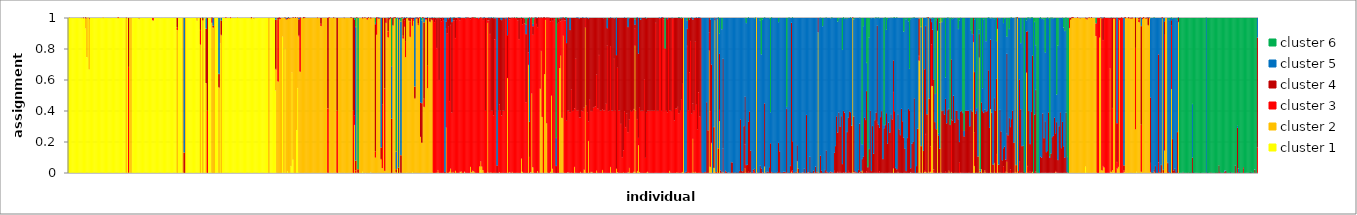
| Category | cluster 1 | cluster 2 | cluster 3 | cluster 4 | cluster 5 | cluster 6 |
|---|---|---|---|---|---|---|
| 0 | 1 | 0 | 0 | 0 | 0 | 0 |
| 1 | 0.999 | 0.001 | 0 | 0 | 0 | 0 |
| 2 | 1 | 0 | 0 | 0 | 0 | 0 |
| 3 | 1 | 0 | 0 | 0 | 0 | 0 |
| 4 | 1 | 0 | 0 | 0 | 0 | 0 |
| 5 | 1 | 0 | 0 | 0 | 0 | 0 |
| 6 | 1 | 0 | 0 | 0 | 0 | 0 |
| 7 | 1 | 0 | 0 | 0 | 0 | 0 |
| 8 | 1 | 0 | 0 | 0 | 0 | 0 |
| 9 | 1 | 0 | 0 | 0 | 0 | 0 |
| 10 | 1 | 0 | 0 | 0 | 0 | 0 |
| 11 | 0.997 | 0.003 | 0 | 0 | 0 | 0 |
| 12 | 1 | 0 | 0 | 0 | 0 | 0 |
| 13 | 0.996 | 0.002 | 0 | 0.002 | 0 | 0 |
| 14 | 1 | 0 | 0 | 0 | 0 | 0 |
| 15 | 0.93 | 0.065 | 0.004 | 0.001 | 0 | 0 |
| 16 | 0.745 | 0.255 | 0 | 0 | 0 | 0 |
| 17 | 0.999 | 0.001 | 0 | 0 | 0 | 0 |
| 18 | 0.666 | 0.326 | 0.004 | 0.004 | 0 | 0 |
| 19 | 1 | 0 | 0 | 0 | 0 | 0 |
| 20 | 1 | 0 | 0 | 0 | 0 | 0 |
| 21 | 1 | 0 | 0 | 0 | 0 | 0 |
| 22 | 1 | 0 | 0 | 0 | 0 | 0 |
| 23 | 1 | 0 | 0 | 0 | 0 | 0 |
| 24 | 1 | 0 | 0 | 0 | 0 | 0 |
| 25 | 1 | 0 | 0 | 0 | 0 | 0 |
| 26 | 1 | 0 | 0 | 0 | 0 | 0 |
| 27 | 1 | 0 | 0 | 0 | 0 | 0 |
| 28 | 1 | 0 | 0 | 0 | 0 | 0 |
| 29 | 1 | 0 | 0 | 0 | 0 | 0 |
| 30 | 0.999 | 0.001 | 0 | 0 | 0 | 0 |
| 31 | 1 | 0 | 0 | 0 | 0 | 0 |
| 32 | 1 | 0 | 0 | 0 | 0 | 0 |
| 33 | 1 | 0 | 0 | 0 | 0 | 0 |
| 34 | 1 | 0 | 0 | 0 | 0 | 0 |
| 35 | 1 | 0 | 0 | 0 | 0 | 0 |
| 36 | 1 | 0 | 0 | 0 | 0 | 0 |
| 37 | 1 | 0 | 0 | 0 | 0 | 0 |
| 38 | 1 | 0 | 0 | 0 | 0 | 0 |
| 39 | 1 | 0 | 0 | 0 | 0 | 0 |
| 40 | 1 | 0 | 0 | 0 | 0 | 0 |
| 41 | 1 | 0 | 0 | 0 | 0 | 0 |
| 42 | 1 | 0 | 0 | 0 | 0 | 0 |
| 43 | 0.998 | 0.001 | 0.001 | 0 | 0 | 0 |
| 44 | 1 | 0 | 0 | 0 | 0 | 0 |
| 45 | 1 | 0 | 0 | 0 | 0 | 0 |
| 46 | 1 | 0 | 0 | 0 | 0 | 0 |
| 47 | 1 | 0 | 0 | 0 | 0 | 0 |
| 48 | 1 | 0 | 0 | 0 | 0 | 0 |
| 49 | 1 | 0 | 0 | 0 | 0 | 0 |
| 50 | 0 | 0.998 | 0 | 0.002 | 0 | 0 |
| 51 | 1 | 0 | 0 | 0 | 0 | 0 |
| 52 | 0 | 0.001 | 0.682 | 0.317 | 0 | 0 |
| 53 | 1 | 0 | 0 | 0 | 0 | 0 |
| 54 | 0 | 1 | 0 | 0 | 0 | 0 |
| 55 | 1 | 0 | 0 | 0 | 0 | 0 |
| 56 | 1 | 0 | 0 | 0 | 0 | 0 |
| 57 | 1 | 0 | 0 | 0 | 0 | 0 |
| 58 | 1 | 0 | 0 | 0 | 0 | 0 |
| 59 | 1 | 0 | 0 | 0 | 0 | 0 |
| 60 | 1 | 0 | 0 | 0 | 0 | 0 |
| 61 | 0.99 | 0.01 | 0 | 0 | 0 | 0 |
| 62 | 1 | 0 | 0 | 0 | 0 | 0 |
| 63 | 1 | 0 | 0 | 0 | 0 | 0 |
| 64 | 1 | 0 | 0 | 0 | 0 | 0 |
| 65 | 1 | 0 | 0 | 0 | 0 | 0 |
| 66 | 1 | 0 | 0 | 0 | 0 | 0 |
| 67 | 1 | 0 | 0 | 0 | 0 | 0 |
| 68 | 1 | 0 | 0 | 0 | 0 | 0 |
| 69 | 1 | 0 | 0 | 0 | 0 | 0 |
| 70 | 1 | 0 | 0 | 0 | 0 | 0 |
| 71 | 1 | 0 | 0 | 0 | 0 | 0 |
| 72 | 1 | 0 | 0 | 0 | 0 | 0 |
| 73 | 0.983 | 0 | 0.017 | 0 | 0 | 0 |
| 74 | 1 | 0 | 0 | 0 | 0 | 0 |
| 75 | 1 | 0 | 0 | 0 | 0 | 0 |
| 76 | 1 | 0 | 0 | 0 | 0 | 0 |
| 77 | 1 | 0 | 0 | 0 | 0 | 0 |
| 78 | 1 | 0 | 0 | 0 | 0 | 0 |
| 79 | 1 | 0 | 0 | 0 | 0 | 0 |
| 80 | 1 | 0 | 0 | 0 | 0 | 0 |
| 81 | 1 | 0 | 0 | 0 | 0 | 0 |
| 82 | 1 | 0 | 0 | 0 | 0 | 0 |
| 83 | 1 | 0 | 0 | 0 | 0 | 0 |
| 84 | 1 | 0 | 0 | 0 | 0 | 0 |
| 85 | 1 | 0 | 0 | 0 | 0 | 0 |
| 86 | 1 | 0 | 0 | 0 | 0 | 0 |
| 87 | 1 | 0 | 0 | 0 | 0 | 0 |
| 88 | 1 | 0 | 0 | 0 | 0 | 0 |
| 89 | 1 | 0 | 0 | 0 | 0 | 0 |
| 90 | 1 | 0 | 0 | 0 | 0 | 0 |
| 91 | 1 | 0 | 0 | 0 | 0 | 0 |
| 92 | 1 | 0 | 0 | 0 | 0 | 0 |
| 93 | 1 | 0 | 0 | 0 | 0 | 0 |
| 94 | 0 | 0.92 | 0.016 | 0.064 | 0 | 0 |
| 95 | 1 | 0 | 0 | 0 | 0 | 0 |
| 96 | 1 | 0 | 0 | 0 | 0 | 0 |
| 97 | 1 | 0 | 0 | 0 | 0 | 0 |
| 98 | 1 | 0 | 0 | 0 | 0 | 0 |
| 99 | 0 | 1 | 0 | 0 | 0 | 0 |
| 100 | 0 | 0 | 0 | 0.13 | 0.87 | 0 |
| 101 | 0 | 1 | 0 | 0 | 0 | 0 |
| 102 | 1 | 0 | 0 | 0 | 0 | 0 |
| 103 | 1 | 0 | 0 | 0 | 0 | 0 |
| 104 | 1 | 0 | 0 | 0 | 0 | 0 |
| 105 | 1 | 0 | 0 | 0 | 0 | 0 |
| 106 | 1 | 0 | 0 | 0 | 0 | 0 |
| 107 | 1 | 0 | 0 | 0 | 0 | 0 |
| 108 | 1 | 0 | 0 | 0 | 0 | 0 |
| 109 | 1 | 0 | 0 | 0 | 0 | 0 |
| 110 | 1 | 0 | 0 | 0 | 0 | 0 |
| 111 | 0.98 | 0.02 | 0 | 0 | 0 | 0 |
| 112 | 1 | 0 | 0 | 0 | 0 | 0 |
| 113 | 1 | 0 | 0 | 0 | 0 | 0 |
| 114 | 0 | 0.827 | 0.094 | 0.079 | 0 | 0 |
| 115 | 1 | 0 | 0 | 0 | 0 | 0 |
| 116 | 0 | 0.985 | 0.001 | 0.013 | 0.002 | 0 |
| 117 | 1 | 0 | 0 | 0 | 0 | 0 |
| 118 | 1 | 0 | 0 | 0 | 0 | 0 |
| 119 | 0 | 0.577 | 0 | 0.352 | 0.068 | 0.003 |
| 120 | 0 | 0 | 0.4 | 0.6 | 0 | 0 |
| 121 | 1 | 0 | 0 | 0 | 0 | 0 |
| 122 | 1 | 0 | 0 | 0 | 0 | 0 |
| 123 | 1 | 0 | 0 | 0 | 0 | 0 |
| 124 | 0 | 0.967 | 0.032 | 0.001 | 0 | 0 |
| 125 | 0 | 0.937 | 0 | 0.011 | 0.052 | 0 |
| 126 | 0 | 1 | 0 | 0 | 0 | 0 |
| 127 | 1 | 0 | 0 | 0 | 0 | 0 |
| 128 | 1 | 0 | 0 | 0 | 0 | 0 |
| 129 | 1 | 0 | 0 | 0 | 0 | 0 |
| 130 | 0 | 0.546 | 0.006 | 0.086 | 0.362 | 0 |
| 131 | 0.836 | 0.164 | 0 | 0 | 0 | 0 |
| 132 | 0 | 0.886 | 0.004 | 0.092 | 0.018 | 0 |
| 133 | 1 | 0 | 0 | 0 | 0 | 0 |
| 134 | 1 | 0 | 0 | 0 | 0 | 0 |
| 135 | 1 | 0 | 0 | 0 | 0 | 0 |
| 136 | 1 | 0 | 0 | 0 | 0 | 0 |
| 137 | 1 | 0 | 0 | 0 | 0 | 0 |
| 138 | 1 | 0 | 0 | 0 | 0 | 0 |
| 139 | 1 | 0 | 0 | 0 | 0 | 0 |
| 140 | 0.999 | 0 | 0.001 | 0 | 0 | 0 |
| 141 | 1 | 0 | 0 | 0 | 0 | 0 |
| 142 | 1 | 0 | 0 | 0 | 0 | 0 |
| 143 | 1 | 0 | 0 | 0 | 0 | 0 |
| 144 | 1 | 0 | 0 | 0 | 0 | 0 |
| 145 | 1 | 0 | 0 | 0 | 0 | 0 |
| 146 | 0.999 | 0.001 | 0 | 0 | 0 | 0 |
| 147 | 1 | 0 | 0 | 0 | 0 | 0 |
| 148 | 1 | 0 | 0 | 0 | 0 | 0 |
| 149 | 1 | 0 | 0 | 0 | 0 | 0 |
| 150 | 1 | 0 | 0 | 0 | 0 | 0 |
| 151 | 1 | 0 | 0 | 0 | 0 | 0 |
| 152 | 1 | 0 | 0 | 0 | 0 | 0 |
| 153 | 1 | 0 | 0 | 0 | 0 | 0 |
| 154 | 1 | 0 | 0 | 0 | 0 | 0 |
| 155 | 1 | 0 | 0 | 0 | 0 | 0 |
| 156 | 1 | 0 | 0 | 0 | 0 | 0 |
| 157 | 1 | 0 | 0 | 0 | 0 | 0 |
| 158 | 0.989 | 0.01 | 0 | 0 | 0 | 0 |
| 159 | 1 | 0 | 0 | 0 | 0 | 0 |
| 160 | 0.991 | 0.009 | 0 | 0 | 0 | 0 |
| 161 | 1 | 0 | 0 | 0 | 0 | 0 |
| 162 | 1 | 0 | 0 | 0 | 0 | 0 |
| 163 | 1 | 0 | 0 | 0 | 0 | 0 |
| 164 | 1 | 0 | 0 | 0 | 0 | 0 |
| 165 | 1 | 0 | 0 | 0 | 0 | 0 |
| 166 | 1 | 0 | 0 | 0 | 0 | 0 |
| 167 | 1 | 0 | 0 | 0 | 0 | 0 |
| 168 | 1 | 0 | 0 | 0 | 0 | 0 |
| 169 | 1 | 0 | 0 | 0 | 0 | 0 |
| 170 | 1 | 0 | 0 | 0 | 0 | 0 |
| 171 | 1 | 0 | 0 | 0 | 0 | 0 |
| 172 | 1 | 0 | 0 | 0 | 0 | 0 |
| 173 | 0 | 1 | 0 | 0 | 0 | 0 |
| 174 | 1 | 0 | 0 | 0 | 0 | 0 |
| 175 | 1 | 0 | 0 | 0 | 0 | 0 |
| 176 | 1 | 0 | 0 | 0 | 0 | 0 |
| 177 | 1 | 0 | 0 | 0 | 0 | 0 |
| 178 | 1 | 0 | 0 | 0 | 0 | 0 |
| 179 | 0.53 | 0.134 | 0.005 | 0.317 | 0.013 | 0 |
| 180 | 0 | 1 | 0 | 0 | 0 | 0 |
| 181 | 0 | 0.589 | 0.398 | 0.014 | 0 | 0 |
| 182 | 0 | 0.991 | 0.008 | 0.001 | 0 | 0 |
| 183 | 0 | 0.993 | 0.007 | 0 | 0 | 0 |
| 184 | 0 | 1 | 0 | 0 | 0 | 0 |
| 185 | 0.878 | 0.122 | 0 | 0 | 0 | 0 |
| 186 | 0.001 | 0.999 | 0 | 0 | 0 | 0 |
| 187 | 0.801 | 0.198 | 0 | 0.001 | 0 | 0 |
| 188 | 0 | 0.99 | 0.002 | 0.002 | 0.006 | 0 |
| 189 | 0.01 | 0.982 | 0.001 | 0.007 | 0 | 0 |
| 190 | 0.001 | 0.998 | 0 | 0.001 | 0.001 | 0 |
| 191 | 0 | 0.995 | 0.005 | 0 | 0 | 0 |
| 192 | 0.043 | 0.957 | 0 | 0 | 0 | 0 |
| 193 | 0.648 | 0.352 | 0 | 0 | 0 | 0 |
| 194 | 0.084 | 0.916 | 0 | 0 | 0 | 0 |
| 195 | 0 | 1 | 0 | 0 | 0 | 0 |
| 196 | 0 | 1 | 0 | 0 | 0 | 0 |
| 197 | 0.275 | 0.725 | 0 | 0 | 0 | 0 |
| 198 | 0.546 | 0.453 | 0.001 | 0 | 0 | 0 |
| 199 | 0.001 | 0.878 | 0.008 | 0.103 | 0.01 | 0 |
| 200 | 0 | 0.652 | 0.348 | 0.001 | 0 | 0 |
| 201 | 0 | 1 | 0 | 0 | 0 | 0 |
| 202 | 0 | 1 | 0 | 0 | 0 | 0 |
| 203 | 0 | 0.997 | 0.003 | 0 | 0 | 0 |
| 204 | 0 | 0.999 | 0 | 0.001 | 0 | 0 |
| 205 | 0 | 1 | 0 | 0 | 0 | 0 |
| 206 | 0 | 1 | 0 | 0 | 0 | 0 |
| 207 | 0 | 1 | 0 | 0 | 0 | 0 |
| 208 | 0 | 1 | 0 | 0 | 0 | 0 |
| 209 | 0 | 1 | 0 | 0 | 0 | 0 |
| 210 | 0 | 1 | 0 | 0 | 0 | 0 |
| 211 | 0 | 1 | 0 | 0 | 0 | 0 |
| 212 | 0 | 1 | 0 | 0 | 0 | 0 |
| 213 | 0 | 1 | 0 | 0 | 0 | 0 |
| 214 | 0 | 1 | 0 | 0 | 0 | 0 |
| 215 | 0 | 0.998 | 0.002 | 0 | 0 | 0 |
| 216 | 0 | 1 | 0 | 0 | 0 | 0 |
| 217 | 0 | 1 | 0 | 0 | 0 | 0 |
| 218 | 0 | 0.946 | 0.014 | 0.04 | 0 | 0 |
| 219 | 0 | 1 | 0 | 0 | 0 | 0 |
| 220 | 0 | 1 | 0 | 0 | 0 | 0 |
| 221 | 0 | 1 | 0 | 0 | 0 | 0 |
| 222 | 0 | 1 | 0 | 0 | 0 | 0 |
| 223 | 0 | 1 | 0 | 0 | 0 | 0 |
| 224 | 0 | 0 | 0.415 | 0.585 | 0 | 0 |
| 225 | 0 | 1 | 0 | 0 | 0 | 0 |
| 226 | 0 | 1 | 0 | 0 | 0 | 0 |
| 227 | 0 | 1 | 0 | 0 | 0 | 0 |
| 228 | 0 | 1 | 0 | 0 | 0 | 0 |
| 229 | 0 | 0.999 | 0 | 0.001 | 0 | 0 |
| 230 | 0 | 1 | 0 | 0 | 0 | 0 |
| 231 | 0 | 1 | 0 | 0 | 0 | 0 |
| 232 | 0 | 0 | 0.4 | 0.6 | 0 | 0 |
| 233 | 0 | 1 | 0 | 0 | 0 | 0 |
| 234 | 0.002 | 0.998 | 0 | 0 | 0 | 0 |
| 235 | 0 | 1 | 0 | 0 | 0 | 0 |
| 236 | 0 | 1 | 0 | 0 | 0 | 0 |
| 237 | 0 | 1 | 0 | 0 | 0 | 0 |
| 238 | 0.002 | 0.996 | 0 | 0.002 | 0 | 0 |
| 239 | 0 | 1 | 0 | 0 | 0 | 0 |
| 240 | 0 | 1 | 0 | 0 | 0 | 0 |
| 241 | 0 | 1 | 0 | 0 | 0 | 0 |
| 242 | 0 | 1 | 0 | 0 | 0 | 0 |
| 243 | 0 | 1 | 0 | 0 | 0 | 0 |
| 244 | 0 | 1 | 0 | 0 | 0 | 0 |
| 245 | 0 | 1 | 0 | 0 | 0 | 0 |
| 246 | 0 | 0 | 0.4 | 0.6 | 0 | 0 |
| 247 | 0 | 0.309 | 0.06 | 0.619 | 0.006 | 0.006 |
| 248 | 0 | 0 | 0.015 | 0.063 | 0.863 | 0.06 |
| 249 | 0 | 1 | 0 | 0 | 0 | 0 |
| 250 | 0 | 0 | 0 | 0.023 | 0 | 0.977 |
| 251 | 0 | 1 | 0 | 0 | 0 | 0 |
| 252 | 0 | 1 | 0 | 0 | 0 | 0 |
| 253 | 0 | 1 | 0 | 0 | 0 | 0 |
| 254 | 0.006 | 0.991 | 0.002 | 0.001 | 0 | 0 |
| 255 | 0 | 1 | 0 | 0 | 0 | 0 |
| 256 | 0 | 0.999 | 0 | 0.001 | 0 | 0 |
| 257 | 0 | 1 | 0 | 0 | 0 | 0 |
| 258 | 0 | 0.988 | 0.012 | 0 | 0 | 0 |
| 259 | 0 | 0.999 | 0 | 0.001 | 0 | 0 |
| 260 | 0 | 1 | 0 | 0 | 0 | 0 |
| 261 | 0.004 | 0.994 | 0.001 | 0.002 | 0 | 0 |
| 262 | 0 | 1 | 0 | 0 | 0 | 0 |
| 263 | 0 | 1 | 0 | 0 | 0 | 0 |
| 264 | 0 | 1 | 0 | 0 | 0 | 0 |
| 265 | 0 | 0.098 | 0.04 | 0.821 | 0.008 | 0.034 |
| 266 | 0 | 0.89 | 0.109 | 0.001 | 0 | 0 |
| 267 | 0 | 0.995 | 0.004 | 0.001 | 0 | 0 |
| 268 | 0 | 0.994 | 0.001 | 0.004 | 0.001 | 0 |
| 269 | 0 | 1 | 0 | 0 | 0 | 0 |
| 270 | 0 | 0.088 | 0 | 0.074 | 0.837 | 0 |
| 271 | 0 | 0.029 | 0.414 | 0.557 | 0 | 0 |
| 272 | 0 | 1 | 0 | 0 | 0 | 0 |
| 273 | 0 | 0.012 | 0.531 | 0.457 | 0 | 0 |
| 274 | 0 | 0.967 | 0.027 | 0.007 | 0 | 0 |
| 275 | 0 | 1 | 0 | 0 | 0 | 0 |
| 276 | 0 | 0.873 | 0.04 | 0.085 | 0.002 | 0 |
| 277 | 0 | 0.986 | 0.005 | 0.009 | 0 | 0 |
| 278 | 0 | 0.997 | 0.001 | 0.001 | 0 | 0 |
| 279 | 0 | 0 | 0 | 0.348 | 0.34 | 0.312 |
| 280 | 0 | 0.951 | 0.002 | 0.048 | 0 | 0 |
| 281 | 0 | 0.999 | 0 | 0.001 | 0 | 0 |
| 282 | 0 | 0.998 | 0.001 | 0 | 0 | 0 |
| 283 | 0 | 0 | 0.004 | 0.019 | 0.113 | 0.864 |
| 284 | 0.022 | 0.972 | 0 | 0.003 | 0.003 | 0 |
| 285 | 0 | 0 | 0 | 0.033 | 0.967 | 0 |
| 286 | 0 | 0.989 | 0 | 0.011 | 0 | 0 |
| 287 | 0 | 0 | 0 | 0.113 | 0.862 | 0.025 |
| 288 | 0 | 1 | 0 | 0 | 0 | 0 |
| 289 | 0 | 0.866 | 0.017 | 0.111 | 0.006 | 0 |
| 290 | 0 | 0.942 | 0.04 | 0.018 | 0 | 0 |
| 291 | 0 | 0.745 | 0.104 | 0.15 | 0 | 0 |
| 292 | 0.001 | 0.996 | 0 | 0.002 | 0.001 | 0 |
| 293 | 0 | 1 | 0 | 0 | 0 | 0 |
| 294 | 0 | 0.978 | 0.006 | 0.016 | 0 | 0 |
| 295 | 0 | 0.876 | 0.099 | 0.023 | 0.001 | 0 |
| 296 | 0 | 0.993 | 0.002 | 0.006 | 0 | 0 |
| 297 | 0.005 | 0.943 | 0.045 | 0.007 | 0 | 0 |
| 298 | 0 | 0.98 | 0.008 | 0.011 | 0 | 0 |
| 299 | 0 | 0.481 | 0.001 | 0.074 | 0.444 | 0 |
| 300 | 0 | 0.993 | 0 | 0.006 | 0.001 | 0 |
| 301 | 0 | 0.996 | 0.003 | 0.001 | 0 | 0 |
| 302 | 0 | 0.954 | 0.008 | 0.038 | 0 | 0 |
| 303 | 0 | 0.999 | 0.001 | 0 | 0 | 0 |
| 304 | 0 | 0.233 | 0 | 0.22 | 0.546 | 0.001 |
| 305 | 0 | 0.195 | 0.001 | 0.254 | 0.534 | 0.016 |
| 306 | 0 | 0.999 | 0 | 0.001 | 0 | 0 |
| 307 | 0 | 0.424 | 0.052 | 0.494 | 0.029 | 0 |
| 308 | 0 | 0.986 | 0.004 | 0.011 | 0 | 0 |
| 309 | 0 | 0.986 | 0.004 | 0.011 | 0 | 0 |
| 310 | 0 | 0.545 | 0.146 | 0.309 | 0 | 0 |
| 311 | 0 | 1 | 0 | 0 | 0 | 0 |
| 312 | 0 | 0.971 | 0.003 | 0.026 | 0 | 0 |
| 313 | 0 | 0.991 | 0.002 | 0.007 | 0 | 0 |
| 314 | 0 | 0.983 | 0.003 | 0.014 | 0.001 | 0 |
| 315 | 0 | 0 | 1 | 0 | 0 | 0 |
| 316 | 0 | 0 | 0.972 | 0.026 | 0 | 0.002 |
| 317 | 0 | 0 | 0.985 | 0.015 | 0 | 0 |
| 318 | 0 | 0.001 | 0.803 | 0.193 | 0 | 0.003 |
| 319 | 0 | 0.017 | 0.983 | 0 | 0 | 0 |
| 320 | 0 | 0 | 0.598 | 0.399 | 0 | 0.002 |
| 321 | 0 | 0 | 0.989 | 0.011 | 0 | 0 |
| 322 | 0 | 0 | 0.977 | 0.023 | 0 | 0 |
| 323 | 0 | 0 | 0.997 | 0.003 | 0 | 0 |
| 324 | 0 | 0 | 0.98 | 0.02 | 0 | 0 |
| 325 | 0 | 0 | 0 | 0.001 | 0.999 | 0 |
| 326 | 0 | 0.292 | 0.636 | 0.047 | 0.025 | 0 |
| 327 | 0 | 0 | 0.898 | 0.102 | 0 | 0 |
| 328 | 0 | 0.001 | 0.941 | 0.049 | 0.008 | 0 |
| 329 | 0 | 0.006 | 0.456 | 0.538 | 0 | 0 |
| 330 | 0 | 0.026 | 0.927 | 0.046 | 0.001 | 0 |
| 331 | 0 | 0.001 | 0.387 | 0.584 | 0.028 | 0 |
| 332 | 0 | 0.005 | 0.978 | 0.016 | 0 | 0.001 |
| 333 | 0 | 0 | 0.983 | 0.016 | 0 | 0 |
| 334 | 0 | 0.012 | 0.856 | 0.131 | 0 | 0 |
| 335 | 0 | 0.001 | 0.984 | 0.016 | 0 | 0 |
| 336 | 0 | 0 | 0.997 | 0.003 | 0 | 0 |
| 337 | 0 | 0 | 1 | 0 | 0 | 0 |
| 338 | 0.005 | 0.001 | 0.978 | 0.015 | 0.001 | 0 |
| 339 | 0 | 0.009 | 0.991 | 0 | 0 | 0 |
| 340 | 0 | 0.001 | 0.999 | 0 | 0 | 0 |
| 341 | 0 | 0 | 0.994 | 0.006 | 0 | 0 |
| 342 | 0.003 | 0.004 | 0.993 | 0 | 0 | 0 |
| 343 | 0 | 0 | 0.995 | 0.005 | 0.001 | 0 |
| 344 | 0 | 0 | 0.999 | 0.001 | 0 | 0 |
| 345 | 0 | 0 | 0.999 | 0.001 | 0 | 0 |
| 346 | 0 | 0 | 1 | 0 | 0 | 0 |
| 347 | 0 | 0.038 | 0.95 | 0.012 | 0 | 0 |
| 348 | 0 | 0.004 | 0.994 | 0.002 | 0 | 0 |
| 349 | 0 | 0.013 | 0.987 | 0.001 | 0 | 0 |
| 350 | 0 | 0.008 | 0.991 | 0.001 | 0 | 0 |
| 351 | 0 | 0.002 | 0.996 | 0.002 | 0 | 0 |
| 352 | 0 | 0 | 1 | 0 | 0 | 0 |
| 353 | 0 | 0 | 1 | 0 | 0 | 0 |
| 354 | 0 | 0 | 0.996 | 0 | 0.004 | 0 |
| 355 | 0 | 0.04 | 0.96 | 0 | 0 | 0 |
| 356 | 0.015 | 0.058 | 0.926 | 0.001 | 0 | 0 |
| 357 | 0 | 0.039 | 0.957 | 0.003 | 0 | 0 |
| 358 | 0 | 0.016 | 0.97 | 0.012 | 0.002 | 0 |
| 359 | 0 | 0 | 0.997 | 0.002 | 0.001 | 0 |
| 360 | 0 | 0 | 0.4 | 0.6 | 0 | 0 |
| 361 | 0 | 0 | 1 | 0 | 0 | 0 |
| 362 | 0.005 | 0.962 | 0.015 | 0.018 | 0 | 0 |
| 363 | 0 | 0 | 0.983 | 0.016 | 0.001 | 0 |
| 364 | 0 | 0.002 | 0.893 | 0.102 | 0.003 | 0 |
| 365 | 0 | 0.002 | 0.399 | 0.599 | 0 | 0 |
| 366 | 0 | 0 | 0.4 | 0.6 | 0 | 0 |
| 367 | 0 | 0.001 | 0.369 | 0.628 | 0.001 | 0.002 |
| 368 | 0 | 0 | 0.86 | 0.137 | 0.003 | 0 |
| 369 | 0 | 0 | 0.997 | 0 | 0.003 | 0 |
| 370 | 0 | 0 | 0 | 0.046 | 0.954 | 0 |
| 371 | 0 | 0 | 0.4 | 0.6 | 0 | 0 |
| 372 | 0 | 0.004 | 0.436 | 0.56 | 0 | 0 |
| 373 | 0 | 0 | 0.401 | 0.59 | 0.01 | 0 |
| 374 | 0 | 0 | 0.369 | 0.616 | 0.015 | 0 |
| 375 | 0 | 0 | 0.4 | 0.6 | 0 | 0 |
| 376 | 0 | 0 | 0.4 | 0.6 | 0 | 0 |
| 377 | 0 | 0 | 0.99 | 0.001 | 0.009 | 0 |
| 378 | 0 | 0 | 0.997 | 0.003 | 0 | 0 |
| 379 | 0 | 0.611 | 0 | 0.277 | 0.112 | 0 |
| 380 | 0 | 0.001 | 0.998 | 0.001 | 0 | 0 |
| 381 | 0 | 0.004 | 0.986 | 0.01 | 0 | 0 |
| 382 | 0 | 0 | 1 | 0 | 0 | 0 |
| 383 | 0 | 0.005 | 0.993 | 0.002 | 0 | 0 |
| 384 | 0 | 0 | 1 | 0 | 0 | 0 |
| 385 | 0 | 0 | 0.999 | 0.001 | 0 | 0 |
| 386 | 0 | 0 | 0.996 | 0.004 | 0 | 0 |
| 387 | 0 | 0 | 1 | 0 | 0 | 0 |
| 388 | 0 | 0 | 0.981 | 0.018 | 0 | 0 |
| 389 | 0 | 0 | 0.862 | 0.138 | 0 | 0 |
| 390 | 0 | 0 | 1 | 0 | 0 | 0 |
| 391 | 0.007 | 0.085 | 0.896 | 0.011 | 0 | 0.001 |
| 392 | 0 | 0.006 | 0.951 | 0.043 | 0 | 0 |
| 393 | 0 | 0 | 1 | 0 | 0 | 0 |
| 394 | 0 | 0 | 0.963 | 0.03 | 0.002 | 0.005 |
| 395 | 0 | 0.001 | 0.454 | 0.44 | 0.062 | 0.043 |
| 396 | 0 | 0 | 0.993 | 0 | 0 | 0.007 |
| 397 | 0 | 0.696 | 0.081 | 0.223 | 0 | 0 |
| 398 | 0 | 0 | 0.102 | 0.228 | 0.669 | 0.001 |
| 399 | 0 | 0.004 | 0.991 | 0.005 | 0 | 0 |
| 400 | 0 | 0.511 | 0.488 | 0.001 | 0 | 0 |
| 401 | 0.035 | 0 | 0.856 | 0.055 | 0.016 | 0.039 |
| 402 | 0 | 0 | 0.988 | 0.008 | 0.002 | 0.002 |
| 403 | 0 | 0 | 0.999 | 0.001 | 0 | 0 |
| 404 | 0 | 0 | 0.96 | 0.039 | 0.001 | 0 |
| 405 | 0 | 0.01 | 0.93 | 0.06 | 0 | 0 |
| 406 | 0 | 0 | 0.999 | 0.001 | 0 | 0 |
| 407 | 0 | 0.541 | 0.459 | 0 | 0 | 0 |
| 408 | 0 | 0.786 | 0.214 | 0.001 | 0 | 0 |
| 409 | 0 | 0.359 | 0.641 | 0 | 0 | 0 |
| 410 | 0 | 0 | 0.999 | 0.001 | 0 | 0 |
| 411 | 0 | 0.636 | 0.364 | 0 | 0 | 0 |
| 412 | 0 | 0.985 | 0.015 | 0 | 0 | 0 |
| 413 | 0 | 0.318 | 0.681 | 0.001 | 0 | 0 |
| 414 | 0 | 0 | 0.998 | 0.002 | 0 | 0 |
| 415 | 0 | 0 | 0.998 | 0.002 | 0 | 0 |
| 416 | 0 | 0.006 | 0.97 | 0.024 | 0 | 0 |
| 417 | 0 | 0.498 | 0.502 | 0 | 0 | 0 |
| 418 | 0 | 0.025 | 0.954 | 0.021 | 0 | 0 |
| 419 | 0 | 0 | 1 | 0 | 0 | 0 |
| 420 | 0 | 0 | 0.991 | 0.009 | 0 | 0 |
| 421 | 0 | 0 | 0 | 0.043 | 0.181 | 0.776 |
| 422 | 0 | 0 | 0.96 | 0.04 | 0 | 0 |
| 423 | 0 | 0 | 0.968 | 0.023 | 0 | 0.008 |
| 424 | 0 | 0.674 | 0.322 | 0.004 | 0 | 0 |
| 425 | 0 | 0.755 | 0.223 | 0.019 | 0.001 | 0.002 |
| 426 | 0 | 0.354 | 0.631 | 0.014 | 0.002 | 0 |
| 427 | 0 | 0.884 | 0.115 | 0.001 | 0 | 0 |
| 428 | 0 | 0 | 0.982 | 0.017 | 0 | 0 |
| 429 | 0 | 0 | 0.984 | 0.015 | 0.001 | 0.001 |
| 430 | 0 | 0 | 0.335 | 0.502 | 0.162 | 0.001 |
| 431 | 0 | 0.003 | 0.397 | 0.601 | 0 | 0 |
| 432 | 0 | 0.002 | 0.4 | 0.598 | 0 | 0 |
| 433 | 0 | 0 | 0.388 | 0.533 | 0.078 | 0 |
| 434 | 0 | 0.002 | 0.535 | 0.463 | 0 | 0 |
| 435 | 0 | 0 | 0.398 | 0.602 | 0 | 0 |
| 436 | 0 | 0 | 0.399 | 0.6 | 0 | 0 |
| 437 | 0 | 0.038 | 0.378 | 0.585 | 0 | 0 |
| 438 | 0 | 0 | 0.735 | 0.265 | 0 | 0 |
| 439 | 0 | 0 | 0.402 | 0.598 | 0 | 0 |
| 440 | 0 | 0 | 0.404 | 0.594 | 0.002 | 0 |
| 441 | 0 | 0 | 0.356 | 0.639 | 0.004 | 0 |
| 442 | 0 | 0.006 | 0.351 | 0.643 | 0 | 0 |
| 443 | 0 | 0 | 0.4 | 0.6 | 0 | 0 |
| 444 | 0 | 0 | 0.398 | 0.602 | 0 | 0 |
| 445 | 0 | 0.019 | 0.4 | 0.581 | 0 | 0 |
| 446 | 0 | 0.937 | 0.056 | 0.007 | 0 | 0 |
| 447 | 0 | 0 | 0.431 | 0.567 | 0.001 | 0 |
| 448 | 0 | 0 | 0.391 | 0.609 | 0 | 0 |
| 449 | 0 | 0.205 | 0.126 | 0.665 | 0.005 | 0 |
| 450 | 0 | 0.001 | 0.469 | 0.53 | 0 | 0 |
| 451 | 0 | 0.005 | 0.393 | 0.602 | 0 | 0 |
| 452 | 0 | 0.005 | 0.393 | 0.602 | 0 | 0 |
| 453 | 0 | 0 | 0.42 | 0.58 | 0 | 0 |
| 454 | 0 | 0 | 0.425 | 0.575 | 0 | 0 |
| 455 | 0 | 0 | 0.429 | 0.571 | 0 | 0 |
| 456 | 0 | 0.013 | 0.619 | 0.368 | 0 | 0 |
| 457 | 0 | 0 | 0.414 | 0.586 | 0 | 0 |
| 458 | 0 | 0 | 0.759 | 0.241 | 0 | 0 |
| 459 | 0 | 0 | 0.401 | 0.599 | 0 | 0 |
| 460 | 0 | 0 | 0.4 | 0.6 | 0 | 0 |
| 461 | 0 | 0.018 | 0.391 | 0.591 | 0 | 0 |
| 462 | 0 | 0 | 0.402 | 0.595 | 0.003 | 0 |
| 463 | 0 | 0 | 0.404 | 0.596 | 0 | 0 |
| 464 | 0 | 0 | 0.445 | 0.555 | 0 | 0 |
| 465 | 0 | 0 | 0.82 | 0.113 | 0.059 | 0.008 |
| 466 | 0 | 0 | 0.398 | 0.602 | 0 | 0 |
| 467 | 0 | 0 | 0.4 | 0.6 | 0 | 0 |
| 468 | 0 | 0.037 | 0.775 | 0.186 | 0.001 | 0 |
| 469 | 0 | 0 | 0.401 | 0.599 | 0 | 0 |
| 470 | 0 | 0 | 0.4 | 0.6 | 0 | 0 |
| 471 | 0 | 0 | 0.734 | 0.261 | 0.005 | 0 |
| 472 | 0 | 0 | 0.401 | 0.599 | 0 | 0 |
| 473 | 0 | 0.026 | 0.001 | 0.731 | 0.239 | 0.002 |
| 474 | 0 | 0.003 | 0.674 | 0.323 | 0 | 0 |
| 475 | 0 | 0 | 0.4 | 0.6 | 0 | 0 |
| 476 | 0 | 0 | 0.4 | 0.6 | 0 | 0 |
| 477 | 0 | 0 | 0.315 | 0.685 | 0 | 0 |
| 478 | 0 | 0 | 0.1 | 0.9 | 0 | 0 |
| 479 | 0 | 0.002 | 0.142 | 0.855 | 0 | 0 |
| 480 | 0 | 0 | 0.396 | 0.602 | 0.001 | 0 |
| 481 | 0 | 0 | 0.294 | 0.706 | 0 | 0 |
| 482 | 0 | 0 | 0.382 | 0.618 | 0 | 0 |
| 483 | 0 | 0.004 | 0.258 | 0.679 | 0.057 | 0.002 |
| 484 | 0 | 0.031 | 0.312 | 0.654 | 0.003 | 0 |
| 485 | 0 | 0 | 0.4 | 0.6 | 0 | 0 |
| 486 | 0 | 0 | 0.393 | 0.607 | 0 | 0 |
| 487 | 0 | 0 | 0.399 | 0.601 | 0 | 0 |
| 488 | 0 | 0.005 | 0.405 | 0.59 | 0 | 0 |
| 489 | 0.82 | 0.001 | 0.108 | 0.027 | 0.033 | 0.012 |
| 490 | 0 | 0 | 0.399 | 0.601 | 0 | 0 |
| 491 | 0 | 0.011 | 0.336 | 0.653 | 0 | 0 |
| 492 | 0 | 0.177 | 0.048 | 0.544 | 0.231 | 0 |
| 493 | 0 | 0.005 | 0.415 | 0.581 | 0 | 0 |
| 494 | 0 | 0 | 0.399 | 0.588 | 0.013 | 0 |
| 495 | 0 | 0 | 0.4 | 0.6 | 0 | 0 |
| 496 | 0 | 0 | 0.4 | 0.6 | 0 | 0 |
| 497 | 0 | 0.001 | 0.602 | 0.397 | 0 | 0 |
| 498 | 0 | 0 | 0.096 | 0.903 | 0.001 | 0 |
| 499 | 0 | 0.002 | 0.385 | 0.609 | 0 | 0.004 |
| 500 | 0 | 0.006 | 0.395 | 0.599 | 0 | 0 |
| 501 | 0 | 0 | 0.4 | 0.6 | 0 | 0 |
| 502 | 0 | 0 | 0.399 | 0.601 | 0 | 0 |
| 503 | 0 | 0 | 0.4 | 0.6 | 0 | 0 |
| 504 | 0 | 0 | 0.4 | 0.6 | 0 | 0 |
| 505 | 0 | 0 | 0.4 | 0.6 | 0 | 0 |
| 506 | 0 | 0 | 0.4 | 0.6 | 0 | 0 |
| 507 | 0 | 0 | 0.967 | 0.033 | 0 | 0 |
| 508 | 0 | 0 | 0.399 | 0.601 | 0 | 0 |
| 509 | 0 | 0 | 0.4 | 0.6 | 0 | 0 |
| 510 | 0 | 0 | 0.994 | 0.005 | 0.001 | 0 |
| 511 | 0 | 0 | 0.994 | 0.006 | 0 | 0 |
| 512 | 0 | 0 | 0.399 | 0.6 | 0 | 0 |
| 513 | 0 | 0 | 1 | 0 | 0 | 0 |
| 514 | 0 | 0 | 0.988 | 0.012 | 0 | 0 |
| 515 | 0 | 0 | 0.799 | 0.002 | 0 | 0.199 |
| 516 | 0 | 0 | 0.4 | 0.6 | 0 | 0 |
| 517 | 0 | 0 | 0.39 | 0.601 | 0.009 | 0 |
| 518 | 0 | 0 | 0.997 | 0.003 | 0 | 0 |
| 519 | 0 | 0.011 | 0.389 | 0.599 | 0 | 0 |
| 520 | 0 | 0 | 0.399 | 0.601 | 0 | 0 |
| 521 | 0 | 0 | 0.996 | 0.002 | 0.002 | 0 |
| 522 | 0 | 0 | 0.994 | 0.006 | 0 | 0 |
| 523 | 0 | 0 | 0.338 | 0.662 | 0 | 0 |
| 524 | 0 | 0 | 0.413 | 0.587 | 0 | 0 |
| 525 | 0 | 0.002 | 0.412 | 0.586 | 0 | 0 |
| 526 | 0 | 0.001 | 0.423 | 0.576 | 0 | 0 |
| 527 | 0 | 0 | 0.382 | 0.618 | 0 | 0 |
| 528 | 0 | 0 | 0.401 | 0.599 | 0 | 0 |
| 529 | 0 | 0.001 | 0.47 | 0.525 | 0.003 | 0.001 |
| 530 | 0 | 0.005 | 0.569 | 0.426 | 0 | 0 |
| 531 | 0 | 1 | 0 | 0 | 0 | 0 |
| 532 | 0 | 0 | 0 | 0 | 1 | 0 |
| 533 | 0 | 0 | 0 | 0.006 | 0.994 | 0 |
| 534 | 0 | 0 | 0.818 | 0.11 | 0.052 | 0.019 |
| 535 | 0 | 0.002 | 0.4 | 0.599 | 0 | 0 |
| 536 | 0 | 0 | 0.648 | 0.341 | 0.002 | 0.009 |
| 537 | 0 | 0 | 0.85 | 0.15 | 0 | 0 |
| 538 | 0 | 0 | 0.38 | 0.618 | 0.001 | 0 |
| 539 | 0 | 0.218 | 0.229 | 0.541 | 0.012 | 0 |
| 540 | 0 | 0.001 | 0.4 | 0.599 | 0 | 0 |
| 541 | 0 | 0.006 | 0.84 | 0.155 | 0 | 0 |
| 542 | 0 | 0 | 0.438 | 0.561 | 0.001 | 0 |
| 543 | 0 | 0 | 0.278 | 0.722 | 0 | 0 |
| 544 | 0 | 0 | 0.519 | 0.48 | 0 | 0 |
| 545 | 0 | 0 | 0.361 | 0.637 | 0.001 | 0 |
| 546 | 0 | 0 | 1 | 0 | 0 | 0 |
| 547 | 0 | 0 | 0 | 0.002 | 0.998 | 0 |
| 548 | 0 | 0 | 0 | 0 | 1 | 0 |
| 549 | 0 | 0 | 0.001 | 0.003 | 0.996 | 0 |
| 550 | 0 | 0 | 0 | 0.005 | 0.995 | 0 |
| 551 | 0 | 0 | 0.001 | 0.454 | 0.544 | 0 |
| 552 | 0 | 0 | 0 | 0.274 | 0.726 | 0 |
| 553 | 0 | 0.789 | 0.116 | 0.095 | 0 | 0 |
| 554 | 0 | 0.038 | 0.36 | 0.59 | 0.008 | 0.004 |
| 555 | 0 | 0.19 | 0.004 | 0.504 | 0.301 | 0 |
| 556 | 0 | 0 | 0 | 0 | 1 | 0 |
| 557 | 0 | 0.032 | 0 | 0.262 | 0.705 | 0 |
| 558 | 0 | 0.982 | 0.015 | 0.003 | 0 | 0 |
| 559 | 0 | 0 | 0 | 0.004 | 0.996 | 0 |
| 560 | 0 | 0.99 | 0 | 0.006 | 0.004 | 0 |
| 561 | 0 | 0 | 0 | 0.158 | 0.842 | 0.001 |
| 562 | 0 | 0.332 | 0.073 | 0.362 | 0.13 | 0.102 |
| 563 | 0 | 0 | 0 | 0.016 | 0.984 | 0 |
| 564 | 0 | 0 | 0 | 0.005 | 0.922 | 0.074 |
| 565 | 0 | 0.005 | 0.152 | 0.579 | 0.264 | 0 |
| 566 | 0 | 0 | 0 | 0 | 1 | 0 |
| 567 | 0 | 0 | 0.01 | 0.003 | 0.987 | 0 |
| 568 | 0 | 0 | 0 | 0.006 | 0.994 | 0 |
| 569 | 0 | 0 | 0 | 0 | 1 | 0 |
| 570 | 0 | 0 | 0 | 0.003 | 0.997 | 0 |
| 571 | 0 | 0 | 0 | 0 | 1 | 0 |
| 572 | 0 | 0 | 0 | 0.068 | 0.932 | 0 |
| 573 | 0 | 0.001 | 0 | 0.066 | 0.933 | 0 |
| 574 | 0 | 0 | 0 | 0.001 | 0.999 | 0 |
| 575 | 0 | 0 | 0 | 0.002 | 0.998 | 0 |
| 576 | 0 | 0 | 0 | 0.002 | 0.998 | 0 |
| 577 | 0 | 0 | 0 | 0 | 1 | 0 |
| 578 | 0 | 0 | 0 | 0.001 | 0.999 | 0 |
| 579 | 0 | 0 | 0 | 0.011 | 0.989 | 0 |
| 580 | 0 | 0 | 0 | 0.345 | 0.655 | 0 |
| 581 | 0 | 0 | 0 | 0.011 | 0.989 | 0 |
| 582 | 0 | 0 | 0 | 0.009 | 0.991 | 0 |
| 583 | 0 | 0 | 0 | 0.301 | 0.699 | 0 |
| 584 | 0 | 0.029 | 0.156 | 0.308 | 0.505 | 0.003 |
| 585 | 0 | 0 | 0 | 0.05 | 0.916 | 0.034 |
| 586 | 0 | 0 | 0 | 0.051 | 0.949 | 0 |
| 587 | 0 | 0 | 0.006 | 0.322 | 0.67 | 0.001 |
| 588 | 0 | 0 | 0 | 0.396 | 0.604 | 0 |
| 589 | 0 | 0.001 | 0.002 | 0.139 | 0.858 | 0 |
| 590 | 0 | 0 | 0 | 0 | 1 | 0 |
| 591 | 0 | 0 | 0.007 | 0.012 | 0.981 | 0 |
| 592 | 0 | 0 | 0.018 | 0.008 | 0.971 | 0.004 |
| 593 | 0 | 0 | 0 | 0.001 | 0.997 | 0.002 |
| 594 | 0 | 1 | 0 | 0 | 0 | 0 |
| 595 | 0 | 0 | 0 | 0 | 1 | 0 |
| 596 | 0 | 0 | 0 | 0.001 | 0.999 | 0 |
| 597 | 0 | 0 | 0 | 0.045 | 0.937 | 0.018 |
| 598 | 0 | 0 | 0 | 0.028 | 0.736 | 0.237 |
| 599 | 0 | 0 | 0 | 0.004 | 0.984 | 0.013 |
| 600 | 0 | 0 | 0 | 0.001 | 0.999 | 0 |
| 601 | 0 | 0.04 | 0 | 0.408 | 0.552 | 0.001 |
| 602 | 0 | 0 | 0 | 0 | 1 | 0 |
| 603 | 0 | 0 | 0 | 0.008 | 0.992 | 0 |
| 604 | 0 | 0 | 0 | 0.005 | 0.995 | 0 |
| 605 | 0 | 0 | 0 | 0.036 | 0.96 | 0.004 |
| 606 | 0 | 0.001 | 0 | 0.189 | 0.2 | 0.61 |
| 607 | 0 | 0 | 0 | 0.005 | 0.995 | 0.001 |
| 608 | 0 | 0 | 0 | 0.001 | 0.999 | 0 |
| 609 | 0 | 0 | 0 | 0.001 | 0.999 | 0 |
| 610 | 0 | 0 | 0 | 0 | 1 | 0 |
| 611 | 0 | 0 | 0 | 0 | 1 | 0 |
| 612 | 0 | 0 | 0 | 0.005 | 0.995 | 0 |
| 613 | 0 | 0 | 0 | 0.193 | 0.779 | 0.028 |
| 614 | 0 | 0 | 0 | 0.139 | 0.861 | 0 |
| 615 | 0 | 0 | 0 | 0.002 | 0.998 | 0 |
| 616 | 0 | 0 | 0 | 0 | 1 | 0 |
| 617 | 0 | 0 | 0 | 0.007 | 0.993 | 0 |
| 618 | 0 | 0 | 0 | 0.006 | 0.994 | 0 |
| 619 | 0 | 0 | 0 | 0.005 | 0.995 | 0 |
| 620 | 0 | 0 | 0 | 0.412 | 0.012 | 0.576 |
| 621 | 0 | 0 | 0 | 0 | 1 | 0 |
| 622 | 0 | 0 | 0 | 0 | 0.999 | 0.001 |
| 623 | 0 | 0 | 0 | 0.044 | 0.956 | 0 |
| 624 | 0 | 0.005 | 0.006 | 0.957 | 0.032 | 0 |
| 625 | 0 | 0 | 0.014 | 0.188 | 0.796 | 0.001 |
| 626 | 0 | 0 | 0 | 0 | 1 | 0 |
| 627 | 0 | 0 | 0 | 0.002 | 0.998 | 0 |
| 628 | 0 | 0 | 0 | 0.006 | 0.994 | 0 |
| 629 | 0 | 0.071 | 0.004 | 0.103 | 0.822 | 0 |
| 630 | 0 | 0 | 0 | 0.027 | 0.973 | 0 |
| 631 | 0 | 0 | 0 | 0 | 1 | 0 |
| 632 | 0 | 0 | 0 | 0.001 | 0.999 | 0 |
| 633 | 0 | 0 | 0 | 0 | 1 | 0 |
| 634 | 0 | 0 | 0 | 0.003 | 0.997 | 0 |
| 635 | 0 | 0 | 0 | 0.026 | 0.974 | 0 |
| 636 | 0 | 0 | 0 | 0 | 1 | 0 |
| 637 | 0 | 0 | 0.001 | 0.373 | 0.627 | 0 |
| 638 | 0 | 0 | 0 | 0.002 | 0.998 | 0 |
| 639 | 0 | 0 | 0 | 0.004 | 0.996 | 0 |
| 640 | 0 | 0 | 0 | 0.103 | 0.897 | 0 |
| 641 | 0 | 0 | 0 | 0 | 1 | 0 |
| 642 | 0 | 0 | 0 | 0 | 1 | 0 |
| 643 | 0 | 0 | 0 | 0.015 | 0.985 | 0 |
| 644 | 0 | 0 | 0 | 0.003 | 0.997 | 0 |
| 645 | 0 | 0 | 0 | 0.04 | 0.96 | 0 |
| 646 | 0 | 0 | 0 | 0.005 | 0.995 | 0 |
| 647 | 0 | 0.906 | 0.094 | 0 | 0 | 0 |
| 648 | 0 | 0 | 0 | 0 | 1 | 0 |
| 649 | 0 | 0 | 0.001 | 0.11 | 0.887 | 0.002 |
| 650 | 0 | 0 | 0 | 0.014 | 0.986 | 0 |
| 651 | 0 | 0 | 0 | 0 | 0.945 | 0.054 |
| 652 | 0 | 0 | 0 | 0 | 1 | 0 |
| 653 | 0 | 0 | 0 | 0.017 | 0.983 | 0 |
| 654 | 0 | 0 | 0.01 | 0.134 | 0.854 | 0.001 |
| 655 | 0 | 0 | 0 | 0.005 | 0.995 | 0 |
| 656 | 0 | 0 | 0 | 0.001 | 0.999 | 0 |
| 657 | 0 | 0 | 0 | 0.002 | 0.998 | 0 |
| 658 | 0 | 0 | 0 | 0.008 | 0.988 | 0.004 |
| 659 | 0 | 0 | 0 | 0.003 | 0.996 | 0.001 |
| 660 | 0 | 0 | 0 | 0.002 | 0.998 | 0 |
| 661 | 0 | 0 | 0.012 | 0.117 | 0.871 | 0 |
| 662 | 0 | 0 | 0 | 0.172 | 0.828 | 0 |
| 663 | 0 | 0 | 0 | 0.364 | 0.636 | 0 |
| 664 | 0 | 0 | 0.005 | 0.255 | 0.716 | 0.025 |
| 665 | 0 | 0 | 0 | 0.388 | 0.606 | 0.006 |
| 666 | 0 | 0 | 0.005 | 0.293 | 0.702 | 0 |
| 667 | 0 | 0 | 0 | 0.366 | 0.634 | 0 |
| 668 | 0 | 0 | 0 | 0.056 | 0.737 | 0.207 |
| 669 | 0 | 0 | 0.002 | 0.396 | 0.6 | 0.001 |
| 670 | 0 | 0 | 0 | 0.388 | 0.606 | 0.006 |
| 671 | 0 | 0 | 0 | 0.003 | 0.997 | 0 |
| 672 | 0 | 0 | 0 | 0.263 | 0.73 | 0.007 |
| 673 | 0 | 0 | 0.012 | 0.344 | 0.644 | 0 |
| 674 | 0 | 0 | 0.002 | 0.393 | 0.604 | 0 |
| 675 | 0 | 0 | 0 | 0.39 | 0.609 | 0.001 |
| 676 | 0 | 0 | 0 | 0.303 | 0.697 | 0 |
| 677 | 0 | 0.999 | 0 | 0.001 | 0 | 0 |
| 678 | 0 | 0 | 0.003 | 0.361 | 0.627 | 0.009 |
| 679 | 0 | 0 | 0.003 | 0.006 | 0.99 | 0 |
| 680 | 0 | 0 | 0.001 | 0.003 | 0.996 | 0 |
| 681 | 0 | 0 | 0 | 0.002 | 0.998 | 0 |
| 682 | 0 | 0 | 0 | 0.018 | 0.982 | 0 |
| 683 | 0 | 0 | 0.003 | 0.314 | 0.68 | 0.002 |
| 684 | 0 | 0 | 0 | 0.009 | 0.991 | 0 |
| 685 | 0.016 | 0 | 0 | 0.072 | 0.094 | 0.818 |
| 686 | 0 | 0 | 0.001 | 0.104 | 0.842 | 0.054 |
| 687 | 0 | 0 | 0 | 0.354 | 0.646 | 0 |
| 688 | 0 | 0 | 0 | 0.341 | 0.659 | 0 |
| 689 | 0 | 0 | 0.01 | 0.518 | 0.181 | 0.291 |
| 690 | 0 | 0 | 0 | 0.036 | 0.002 | 0.962 |
| 691 | 0 | 0 | 0 | 0.153 | 0.721 | 0.126 |
| 692 | 0 | 0 | 0 | 0.4 | 0.6 | 0 |
| 693 | 0 | 0 | 0 | 0.011 | 0.985 | 0.004 |
| 694 | 0 | 0 | 0.001 | 0.301 | 0.698 | 0 |
| 695 | 0 | 0 | 0 | 0.122 | 0.878 | 0 |
| 696 | 0 | 0 | 0 | 0.339 | 0.657 | 0.004 |
| 697 | 0 | 0 | 0 | 0.387 | 0.613 | 0.001 |
| 698 | 0 | 0 | 0.328 | 0.623 | 0.05 | 0 |
| 699 | 0 | 0 | 0 | 0.31 | 0.688 | 0.001 |
| 700 | 0 | 0 | 0.01 | 0.282 | 0.705 | 0.003 |
| 701 | 0 | 0 | 0 | 0.359 | 0.641 | 0 |
| 702 | 0 | 0 | 0 | 0.398 | 0.602 | 0 |
| 703 | 0 | 0 | 0 | 0.089 | 0.911 | 0 |
| 704 | 0 | 0 | 0.001 | 0.287 | 0.02 | 0.692 |
| 705 | 0 | 0 | 0 | 0.308 | 0.691 | 0.001 |
| 706 | 0 | 0 | 0 | 0.385 | 0.538 | 0.078 |
| 707 | 0 | 0 | 0 | 0.188 | 0.803 | 0.008 |
| 708 | 0 | 0 | 0 | 0.323 | 0.677 | 0 |
| 709 | 0 | 0 | 0 | 0.259 | 0.741 | 0 |
| 710 | 0 | 0 | 0 | 0.378 | 0.62 | 0.002 |
| 711 | 0 | 0 | 0 | 0.344 | 0.656 | 0 |
| 712 | 0 | 0.028 | 0.493 | 0.205 | 0.273 | 0.002 |
| 713 | 0 | 0 | 0 | 0.397 | 0.603 | 0.001 |
| 714 | 0 | 0 | 0 | 0.031 | 0.969 | 0 |
| 715 | 0 | 0 | 0 | 0.022 | 0.977 | 0.001 |
| 716 | 0 | 0.002 | 0.004 | 0.372 | 0.622 | 0 |
| 717 | 0 | 0 | 0 | 0.279 | 0.721 | 0 |
| 718 | 0 | 0 | 0 | 0.243 | 0.757 | 0 |
| 719 | 0 | 0 | 0 | 0.413 | 0.587 | 0 |
| 720 | 0 | 0 | 0 | 0.332 | 0.668 | 0 |
| 721 | 0 | 0 | 0 | 0.225 | 0.685 | 0.09 |
| 722 | 0 | 0 | 0 | 0.156 | 0.844 | 0 |
| 723 | 0 | 0 | 0 | 0.011 | 0.978 | 0.011 |
| 724 | 0 | 0 | 0 | 0.224 | 0.776 | 0 |
| 725 | 0 | 0 | 0 | 0.412 | 0.566 | 0.022 |
| 726 | 0 | 0 | 0 | 0.402 | 0.268 | 0.329 |
| 727 | 0 | 0 | 0.004 | 0.025 | 0.963 | 0.008 |
| 728 | 0 | 0 | 0 | 0.187 | 0.813 | 0 |
| 729 | 0 | 0 | 0.001 | 0.199 | 0.798 | 0.002 |
| 730 | 0 | 0 | 0 | 0.481 | 0.519 | 0.001 |
| 731 | 0 | 0 | 0 | 0 | 1 | 0 |
| 732 | 0 | 0 | 0 | 0.043 | 0.957 | 0 |
| 733 | 0 | 0 | 0 | 0.283 | 0.717 | 0 |
| 734 | 0 | 0.723 | 0.03 | 0.241 | 0.005 | 0 |
| 735 | 0 | 1 | 0 | 0 | 0 | 0 |
| 736 | 0 | 0 | 0 | 0.172 | 0.769 | 0.059 |
| 737 | 0 | 1 | 0 | 0 | 0 | 0 |
| 738 | 0 | 0 | 0 | 0.141 | 0.859 | 0 |
| 739 | 0 | 0.005 | 0.007 | 0.656 | 0.332 | 0 |
| 740 | 0 | 0.006 | 0.244 | 0.697 | 0.053 | 0 |
| 741 | 0 | 0 | 0 | 0.377 | 0.622 | 0.001 |
| 742 | 0 | 0.999 | 0 | 0.001 | 0 | 0 |
| 743 | 0 | 0.003 | 0.002 | 0.472 | 0.523 | 0 |
| 744 | 0 | 0.006 | 0.165 | 0.824 | 0.005 | 0 |
| 745 | 0 | 0.56 | 0.268 | 0.145 | 0.023 | 0.004 |
| 746 | 0 | 0.555 | 0.004 | 0.364 | 0.075 | 0.002 |
| 747 | 0 | 0 | 0.02 | 0.58 | 0.4 | 0 |
| 748 | 0 | 0 | 0 | 0.327 | 0.182 | 0.491 |
| 749 | 0 | 0 | 0 | 0.281 | 0.704 | 0.015 |
| 750 | 0 | 0.917 | 0.001 | 0.079 | 0.003 | 0 |
| 751 | 0 | 0 | 0 | 0.241 | 0.012 | 0.746 |
| 752 | 0 | 0 | 0 | 0.156 | 0.814 | 0.03 |
| 753 | 0 | 1 | 0 | 0 | 0 | 0 |
| 754 | 0 | 0 | 0 | 0.398 | 0.574 | 0.027 |
| 755 | 0 | 0 | 0 | 0.403 | 0.59 | 0.007 |
| 756 | 0 | 0 | 0 | 0.376 | 0.624 | 0 |
| 757 | 0 | 0 | 0.007 | 0.47 | 0.138 | 0.386 |
| 758 | 0 | 0 | 0 | 0.319 | 0.681 | 0 |
| 759 | 0 | 0 | 0 | 0.404 | 0.595 | 0.001 |
| 760 | 0 | 0.013 | 0 | 0.399 | 0.585 | 0.002 |
| 761 | 0 | 0 | 0 | 0.309 | 0.001 | 0.69 |
| 762 | 0 | 0.005 | 0.339 | 0.388 | 0.266 | 0.002 |
| 763 | 0 | 0 | 0 | 0.338 | 0.654 | 0.008 |
| 764 | 0 | 0 | 0 | 0.497 | 0.5 | 0.003 |
| 765 | 0 | 0 | 0 | 0.322 | 0.678 | 0 |
| 766 | 0 | 0.001 | 0 | 0.4 | 0.599 | 0 |
| 767 | 0 | 0 | 0 | 0.401 | 0.596 | 0.003 |
| 768 | 0 | 0 | 0 | 0.345 | 0.583 | 0.072 |
| 769 | 0 | 0 | 0.065 | 0.134 | 0.785 | 0.016 |
| 770 | 0 | 0.002 | 0.001 | 0.391 | 0.603 | 0.002 |
| 771 | 0 | 0 | 0 | 0.398 | 0.602 | 0 |
| 772 | 0 | 0 | 0 | 0.386 | 0.008 | 0.606 |
| 773 | 0 | 0 | 0.001 | 0.233 | 0.037 | 0.729 |
| 774 | 0 | 0 | 0 | 0.4 | 0.6 | 0 |
| 775 | 0 | 0 | 0 | 0.4 | 0.6 | 0 |
| 776 | 0 | 0 | 0 | 0.4 | 0.6 | 0 |
| 777 | 0 | 0.001 | 0 | 0.4 | 0.6 | 0 |
| 778 | 0 | 0 | 0 | 0.3 | 0.7 | 0 |
| 779 | 0 | 0 | 0.001 | 0.404 | 0.515 | 0.08 |
| 780 | 0 | 0 | 0 | 0.394 | 0.501 | 0.104 |
| 781 | 0 | 0.843 | 0.048 | 0.11 | 0 | 0 |
| 782 | 0 | 0.044 | 0.215 | 0.391 | 0.338 | 0.012 |
| 783 | 0 | 0 | 0 | 0.38 | 0.62 | 0 |
| 784 | 0 | 0 | 0 | 0.398 | 0.019 | 0.583 |
| 785 | 0 | 0.001 | 0.001 | 0.103 | 0.896 | 0 |
| 786 | 0 | 0.745 | 0.001 | 0.15 | 0.027 | 0.078 |
| 787 | 0 | 0 | 0 | 0.008 | 0.012 | 0.98 |
| 788 | 0 | 0.022 | 0 | 0.432 | 0.546 | 0 |
| 789 | 0 | 0 | 0 | 0.397 | 0.148 | 0.455 |
| 790 | 0 | 0 | 0 | 0.386 | 0.605 | 0.009 |
| 791 | 0 | 0.015 | 0 | 0.394 | 0.591 | 0 |
| 792 | 0 | 0 | 0 | 0.394 | 0.455 | 0.151 |
| 793 | 0 | 0 | 0 | 0.398 | 0.602 | 0 |
| 794 | 0 | 0 | 0 | 0.661 | 0.338 | 0.001 |
| 795 | 0 | 0 | 0 | 0.29 | 0.708 | 0.002 |
| 796 | 0 | 0.41 | 0 | 0.449 | 0.138 | 0.004 |
| 797 | 0 | 0 | 0 | 0.386 | 0.611 | 0.002 |
| 798 | 0 | 0 | 0 | 0.052 | 0.948 | 0 |
| 799 | 0 | 0.064 | 0.001 | 0.417 | 0.51 | 0.008 |
| 800 | 0 | 0 | 0 | 0.4 | 0.6 | 0 |
| 801 | 0 | 0 | 0.121 | 0.485 | 0.244 | 0.15 |
| 802 | 0 | 0.928 | 0.069 | 0.003 | 0 | 0 |
| 803 | 0 | 0 | 0 | 0.052 | 0.948 | 0 |
| 804 | 0 | 0.001 | 0 | 0.405 | 0.59 | 0.005 |
| 805 | 0 | 0 | 0 | 0.265 | 0.735 | 0 |
| 806 | 0 | 0 | 0 | 0.08 | 0.92 | 0 |
| 807 | 0 | 0 | 0.042 | 0.117 | 0.808 | 0.034 |
| 808 | 0 | 0 | 0 | 0.17 | 0.824 | 0.006 |
| 809 | 0 | 0.001 | 0.005 | 0.079 | 0.916 | 0 |
| 810 | 0 | 0.071 | 0.18 | 0.517 | 0.11 | 0.122 |
| 811 | 0 | 0 | 0 | 0.241 | 0.759 | 0 |
| 812 | 0 | 0 | 0 | 0.353 | 0.575 | 0.072 |
| 813 | 0 | 0 | 0.022 | 0.273 | 0.702 | 0.002 |
| 814 | 0 | 0 | 0.001 | 0.345 | 0.653 | 0.001 |
| 815 | 0 | 0 | 0 | 0.401 | 0.599 | 0 |
| 816 | 0 | 0 | 0 | 0.194 | 0.806 | 0 |
| 817 | 0 | 1 | 0 | 0 | 0 | 0 |
| 818 | 0 | 0.004 | 0 | 0.046 | 0.949 | 0.001 |
| 819 | 0 | 0.999 | 0 | 0.001 | 0 | 0 |
| 820 | 0 | 0 | 0 | 0.011 | 0.989 | 0 |
| 821 | 0 | 0 | 0.07 | 0.532 | 0.398 | 0 |
| 822 | 0 | 0 | 0 | 0.41 | 0.427 | 0.164 |
| 823 | 0 | 0.001 | 0 | 0.17 | 0.828 | 0 |
| 824 | 0 | 0 | 0.001 | 0.174 | 0.825 | 0 |
| 825 | 0 | 0 | 0 | 0 | 0 | 1 |
| 826 | 0 | 0 | 0 | 0.002 | 0.998 | 0 |
| 827 | 0 | 0.646 | 0.001 | 0.263 | 0.073 | 0.017 |
| 828 | 0 | 0 | 0.043 | 0.871 | 0.084 | 0.002 |
| 829 | 0 | 0 | 0 | 0.399 | 0.6 | 0.001 |
| 830 | 0 | 0 | 0.007 | 0.178 | 0.809 | 0.006 |
| 831 | 0 | 0 | 0 | 0.393 | 0.607 | 0 |
| 832 | 0 | 0.007 | 0 | 0.749 | 0.243 | 0.001 |
| 833 | 0 | 0 | 0 | 0 | 0 | 1 |
| 834 | 0 | 0 | 0.001 | 0.375 | 0.597 | 0.027 |
| 835 | 0 | 0 | 0.009 | 0.526 | 0.289 | 0.177 |
| 836 | 0 | 0 | 0 | 0 | 0 | 1 |
| 837 | 0 | 0 | 0 | 0 | 0 | 1 |
| 838 | 0 | 0 | 0 | 0 | 1 | 0 |
| 839 | 0 | 0 | 0 | 0.104 | 0.896 | 0 |
| 840 | 0 | 0 | 0 | 0.097 | 0.895 | 0.007 |
| 841 | 0 | 0 | 0 | 0.383 | 0.612 | 0.006 |
| 842 | 0 | 0 | 0 | 0.223 | 0.768 | 0.009 |
| 843 | 0 | 0 | 0.002 | 0.331 | 0.443 | 0.224 |
| 844 | 0 | 0 | 0 | 0.133 | 0.867 | 0 |
| 845 | 0 | 0 | 0 | 0.14 | 0.858 | 0.001 |
| 846 | 0 | 0 | 0 | 0.39 | 0.607 | 0.003 |
| 847 | 0 | 0 | 0 | 0.096 | 0.01 | 0.894 |
| 848 | 0 | 0 | 0.001 | 0.122 | 0.875 | 0.002 |
| 849 | 0 | 0 | 0 | 0.23 | 0.768 | 0.002 |
| 850 | 0 | 0 | 0 | 0.238 | 0.755 | 0.006 |
| 851 | 0 | 0 | 0 | 0.357 | 0.643 | 0 |
| 852 | 0 | 0.004 | 0.007 | 0.244 | 0.745 | 0 |
| 853 | 0 | 0 | 0.005 | 0.322 | 0.177 | 0.496 |
| 854 | 0 | 0 | 0 | 0.083 | 0.737 | 0.18 |
| 855 | 0 | 0 | 0 | 0.3 | 0.7 | 0 |
| 856 | 0 | 0 | 0 | 0.391 | 0.609 | 0 |
| 857 | 0 | 0 | 0 | 0.159 | 0.841 | 0 |
| 858 | 0 | 0 | 0 | 0.328 | 0.669 | 0.002 |
| 859 | 0 | 0 | 0 | 0.171 | 0.766 | 0.063 |
| 860 | 0 | 0 | 0 | 0.098 | 0.817 | 0.085 |
| 861 | 0 | 0 | 0 | 0.388 | 0.611 | 0.001 |
| 862 | 0 | 0 | 0 | 0.003 | 0.099 | 0.898 |
| 863 | 0 | 0 | 0 | 0 | 0 | 1 |
| 864 | 0 | 0.934 | 0.063 | 0.003 | 0 | 0 |
| 865 | 0 | 0.99 | 0 | 0.009 | 0 | 0 |
| 866 | 0 | 0.999 | 0 | 0.001 | 0 | 0 |
| 867 | 0 | 0.999 | 0 | 0 | 0 | 0 |
| 868 | 0 | 1 | 0 | 0 | 0 | 0 |
| 869 | 0 | 1 | 0 | 0 | 0 | 0 |
| 870 | 0 | 1 | 0 | 0 | 0 | 0 |
| 871 | 0 | 0.999 | 0.001 | 0 | 0 | 0 |
| 872 | 0 | 1 | 0 | 0 | 0 | 0 |
| 873 | 0 | 0.996 | 0 | 0.004 | 0 | 0 |
| 874 | 0 | 1 | 0 | 0 | 0 | 0 |
| 875 | 0 | 1 | 0 | 0 | 0 | 0 |
| 876 | 0 | 1 | 0 | 0 | 0 | 0 |
| 877 | 0 | 1 | 0 | 0 | 0 | 0 |
| 878 | 0.039 | 0.957 | 0.002 | 0.002 | 0 | 0 |
| 879 | 0 | 0.989 | 0.005 | 0.005 | 0 | 0 |
| 880 | 0 | 1 | 0 | 0 | 0 | 0 |
| 881 | 0 | 0.999 | 0.001 | 0 | 0 | 0 |
| 882 | 0 | 1 | 0 | 0 | 0 | 0 |
| 883 | 0 | 1 | 0 | 0 | 0 | 0 |
| 884 | 0 | 1 | 0 | 0 | 0 | 0 |
| 885 | 0 | 1 | 0 | 0 | 0 | 0 |
| 886 | 0 | 1 | 0 | 0 | 0 | 0 |
| 887 | 0.001 | 0.88 | 0.08 | 0.005 | 0 | 0.033 |
| 888 | 0 | 0 | 1 | 0 | 0 | 0 |
| 889 | 0 | 0 | 1 | 0 | 0 | 0 |
| 890 | 0 | 0.872 | 0.128 | 0 | 0 | 0 |
| 891 | 0 | 0.998 | 0 | 0.002 | 0 | 0 |
| 892 | 0 | 0.015 | 0.981 | 0.003 | 0.001 | 0 |
| 893 | 0 | 0.043 | 0.813 | 0.142 | 0.002 | 0 |
| 894 | 0 | 0.034 | 0.966 | 0 | 0 | 0 |
| 895 | 0 | 0 | 1 | 0 | 0 | 0 |
| 896 | 0 | 0 | 1 | 0 | 0 | 0 |
| 897 | 0 | 0 | 1 | 0 | 0 | 0 |
| 898 | 0 | 0 | 1 | 0 | 0 | 0 |
| 899 | 0 | 0.675 | 0.318 | 0.007 | 0 | 0 |
| 900 | 0 | 0.006 | 0.991 | 0.001 | 0 | 0.002 |
| 901 | 0 | 0.016 | 0.402 | 0.582 | 0 | 0 |
| 902 | 0.003 | 0.993 | 0.001 | 0.003 | 0 | 0 |
| 903 | 0 | 0.994 | 0.002 | 0.004 | 0 | 0 |
| 904 | 0 | 0 | 1 | 0 | 0 | 0 |
| 905 | 0 | 0.027 | 0.042 | 0.25 | 0.678 | 0.002 |
| 906 | 0 | 0.038 | 0.95 | 0.012 | 0 | 0 |
| 907 | 0 | 0.984 | 0.016 | 0 | 0 | 0 |
| 908 | 0 | 0 | 1 | 0 | 0 | 0 |
| 909 | 0 | 0 | 0.999 | 0.001 | 0 | 0 |
| 910 | 0 | 0 | 1 | 0 | 0 | 0 |
| 911 | 0 | 0.006 | 0.008 | 0.032 | 0.953 | 0 |
| 912 | 0 | 0.999 | 0.001 | 0 | 0 | 0 |
| 913 | 0 | 1 | 0 | 0 | 0 | 0 |
| 914 | 0.001 | 0.999 | 0 | 0 | 0 | 0 |
| 915 | 0 | 0.997 | 0.002 | 0.001 | 0 | 0 |
| 916 | 0 | 0.997 | 0.003 | 0 | 0 | 0 |
| 917 | 0 | 0.996 | 0.001 | 0.003 | 0 | 0 |
| 918 | 0 | 0.997 | 0.001 | 0.002 | 0 | 0 |
| 919 | 0.001 | 0.999 | 0 | 0 | 0 | 0 |
| 920 | 0 | 1 | 0 | 0 | 0 | 0 |
| 921 | 0 | 0.28 | 0.525 | 0.194 | 0.001 | 0 |
| 922 | 0.006 | 0.994 | 0 | 0 | 0 | 0 |
| 923 | 0 | 1 | 0 | 0 | 0 | 0 |
| 924 | 0 | 0.97 | 0.019 | 0.01 | 0 | 0 |
| 925 | 0 | 0.999 | 0.001 | 0 | 0 | 0 |
| 926 | 0 | 0.006 | 0.303 | 0.637 | 0.054 | 0 |
| 927 | 0 | 0.991 | 0.009 | 0 | 0 | 0 |
| 928 | 0 | 0.999 | 0 | 0.001 | 0 | 0 |
| 929 | 0 | 1 | 0 | 0 | 0 | 0 |
| 930 | 0 | 0.995 | 0.001 | 0.004 | 0 | 0 |
| 931 | 0 | 0.999 | 0.001 | 0 | 0 | 0 |
| 932 | 0 | 0.953 | 0 | 0.046 | 0.001 | 0 |
| 933 | 0 | 0.998 | 0.002 | 0 | 0 | 0 |
| 934 | 0 | 0.005 | 0.058 | 0.423 | 0.51 | 0.004 |
| 935 | 0 | 0 | 0 | 0.002 | 0.998 | 0 |
| 936 | 0 | 0 | 0 | 0.001 | 0.999 | 0 |
| 937 | 0 | 0.006 | 0.004 | 0.008 | 0.982 | 0.001 |
| 938 | 0 | 0 | 0 | 0.044 | 0.956 | 0 |
| 939 | 0 | 0 | 0 | 0 | 1 | 0 |
| 940 | 0 | 0 | 0 | 0 | 1 | 0 |
| 941 | 0 | 0 | 0.067 | 0.696 | 0.236 | 0 |
| 942 | 0 | 0.001 | 0 | 0.004 | 0.995 | 0 |
| 943 | 0 | 0 | 0 | 0.05 | 0.95 | 0 |
| 944 | 0 | 0.998 | 0 | 0.001 | 0 | 0 |
| 945 | 0 | 0 | 0 | 0.018 | 0.982 | 0 |
| 946 | 0 | 0.143 | 0.747 | 0.087 | 0.023 | 0 |
| 947 | 0 | 1 | 0 | 0 | 0 | 0 |
| 948 | 0 | 1 | 0 | 0 | 0 | 0 |
| 949 | 0 | 0 | 0 | 0.062 | 0.937 | 0 |
| 950 | 0 | 0 | 0 | 0.003 | 0.982 | 0.015 |
| 951 | 0 | 0 | 0 | 0.001 | 0.999 | 0 |
| 952 | 0 | 0.54 | 0.409 | 0.036 | 0.014 | 0.001 |
| 953 | 0 | 0.001 | 0.001 | 0.216 | 0.776 | 0.006 |
| 954 | 0 | 0 | 0 | 0.015 | 0.985 | 0 |
| 955 | 0 | 0 | 0 | 0.027 | 0.973 | 0 |
| 956 | 0 | 0 | 0 | 0.001 | 0.999 | 0 |
| 957 | 0 | 0 | 0 | 0.263 | 0.722 | 0.016 |
| 958 | 0 | 0.973 | 0 | 0.026 | 0.001 | 0 |
| 959 | 0 | 0 | 0 | 0 | 0 | 1 |
| 960 | 0 | 0 | 0 | 0 | 0 | 1 |
| 961 | 0 | 0 | 0 | 0 | 0 | 1 |
| 962 | 0 | 0 | 0.004 | 0 | 0.001 | 0.994 |
| 963 | 0 | 0 | 0 | 0 | 0 | 1 |
| 964 | 0 | 0 | 0 | 0 | 0 | 1 |
| 965 | 0 | 0 | 0 | 0 | 0 | 1 |
| 966 | 0 | 0 | 0.001 | 0 | 0 | 0.999 |
| 967 | 0 | 0 | 0 | 0 | 0 | 1 |
| 968 | 0 | 0 | 0 | 0 | 0 | 1 |
| 969 | 0 | 0 | 0 | 0 | 0 | 1 |
| 970 | 0 | 0 | 0 | 0.098 | 0.347 | 0.556 |
| 971 | 0 | 0 | 0.002 | 0.001 | 0.001 | 0.996 |
| 972 | 0 | 0 | 0 | 0 | 0 | 1 |
| 973 | 0 | 0 | 0 | 0 | 0 | 1 |
| 974 | 0 | 0 | 0 | 0 | 0 | 1 |
| 975 | 0 | 0 | 0 | 0 | 0 | 1 |
| 976 | 0 | 0 | 0 | 0 | 0 | 1 |
| 977 | 0 | 0 | 0 | 0 | 0 | 1 |
| 978 | 0 | 0 | 0 | 0 | 0 | 1 |
| 979 | 0 | 0 | 0 | 0 | 0 | 1 |
| 980 | 0 | 0 | 0 | 0 | 0 | 1 |
| 981 | 0 | 0 | 0 | 0 | 0 | 1 |
| 982 | 0 | 0 | 0 | 0.002 | 0.996 | 0.002 |
| 983 | 0 | 0 | 0 | 0 | 0.001 | 0.999 |
| 984 | 0 | 0 | 0 | 0 | 0 | 1 |
| 985 | 0 | 0 | 0 | 0 | 0 | 1 |
| 986 | 0 | 0 | 0.001 | 0 | 0 | 0.999 |
| 987 | 0 | 0 | 0 | 0 | 0 | 1 |
| 988 | 0 | 0 | 0 | 0 | 0 | 1 |
| 989 | 0 | 0 | 0 | 0 | 0 | 1 |
| 990 | 0 | 0 | 0.001 | 0 | 0 | 0.999 |
| 991 | 0 | 0 | 0.001 | 0 | 0 | 0.999 |
| 992 | 0 | 0 | 0 | 0 | 0 | 1 |
| 993 | 0 | 0 | 0 | 0.048 | 0 | 0.952 |
| 994 | 0 | 0 | 0 | 0.005 | 0.001 | 0.994 |
| 995 | 0 | 0 | 0 | 0 | 0 | 1 |
| 996 | 0 | 0 | 0 | 0 | 0 | 1 |
| 997 | 0 | 0 | 0 | 0 | 0 | 1 |
| 998 | 0 | 0 | 0 | 0.008 | 0.008 | 0.984 |
| 999 | 0 | 0 | 0 | 0.013 | 0 | 0.987 |
| 1000 | 0 | 0 | 0 | 0 | 0 | 1 |
| 1001 | 0 | 0 | 0 | 0 | 0 | 1 |
| 1002 | 0 | 0 | 0 | 0 | 0 | 1 |
| 1003 | 0 | 0 | 0.001 | 0.002 | 0.002 | 0.996 |
| 1004 | 0 | 0 | 0 | 0 | 0 | 1 |
| 1005 | 0 | 0 | 0 | 0 | 0 | 1 |
| 1006 | 0 | 0 | 0 | 0 | 0 | 1 |
| 1007 | 0 | 0 | 0.001 | 0.046 | 0.002 | 0.951 |
| 1008 | 0 | 0 | 0 | 0 | 0 | 1 |
| 1009 | 0 | 0 | 0.026 | 0.265 | 0.012 | 0.697 |
| 1010 | 0 | 0 | 0 | 0.002 | 0.026 | 0.972 |
| 1011 | 0 | 0 | 0 | 0.001 | 0 | 0.998 |
| 1012 | 0 | 0 | 0 | 0 | 0 | 1 |
| 1013 | 0 | 0 | 0 | 0 | 0 | 1 |
| 1014 | 0 | 0 | 0.028 | 0.008 | 0 | 0.964 |
| 1015 | 0 | 0 | 0 | 0 | 0.001 | 0.999 |
| 1016 | 0 | 0 | 0 | 0 | 0 | 1 |
| 1017 | 0 | 0 | 0 | 0 | 0 | 1 |
| 1018 | 0 | 0 | 0 | 0 | 0 | 1 |
| 1019 | 0 | 0 | 0 | 0 | 0 | 1 |
| 1020 | 0 | 0 | 0 | 0 | 0 | 0.999 |
| 1021 | 0 | 0 | 0 | 0.001 | 0.005 | 0.995 |
| 1022 | 0 | 0 | 0 | 0 | 0 | 1 |
| 1023 | 0 | 0 | 0 | 0 | 0 | 1 |
| 1024 | 0 | 0 | 0 | 0.019 | 0.003 | 0.978 |
| 1025 | 0 | 0 | 0 | 0 | 0 | 1 |
| 1026 | 0 | 0 | 0.163 | 0.709 | 0.128 | 0 |